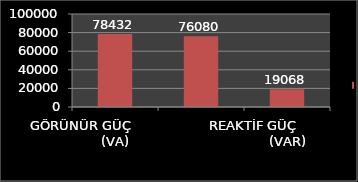
| Category | Series 0 |
|---|---|
| GÖRÜNÜR GÜÇ                 (VA) | 78432 |
| AKTİF GÜÇ                     (W) | 76080 |
| REAKTİF GÜÇ                 (VAR) | 19068 |